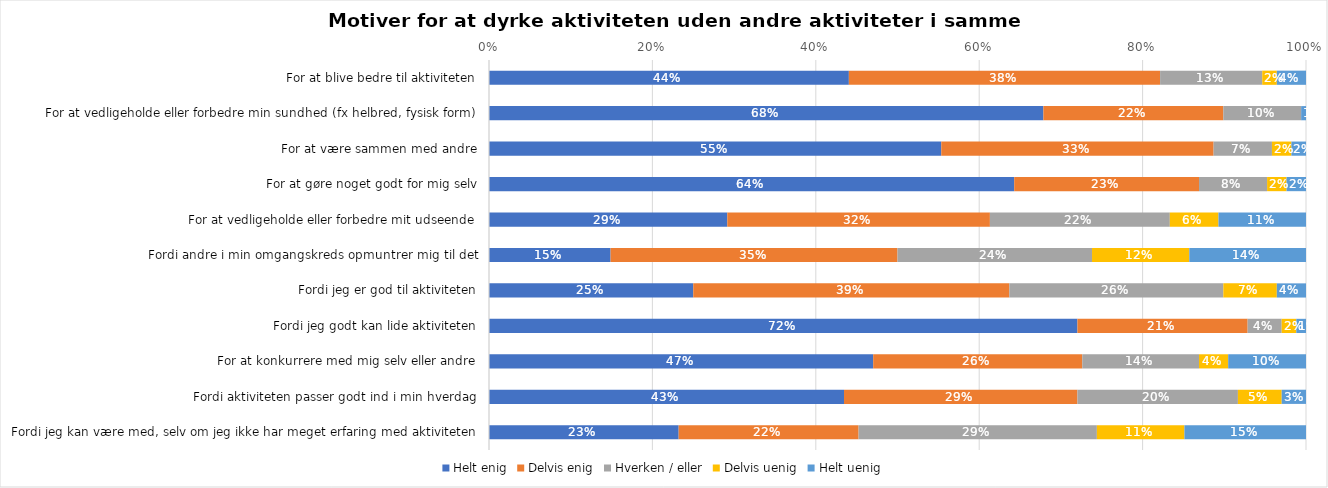
| Category | Helt enig | Delvis enig | Hverken / eller | Delvis uenig | Helt uenig |
|---|---|---|---|---|---|
| For at blive bedre til aktiviteten | 0.44 | 0.381 | 0.125 | 0.018 | 0.036 |
| For at vedligeholde eller forbedre min sundhed (fx helbred, fysisk form) | 0.679 | 0.22 | 0.095 | 0 | 0.006 |
| For at være sammen med andre | 0.554 | 0.333 | 0.071 | 0.024 | 0.018 |
| For at gøre noget godt for mig selv | 0.643 | 0.226 | 0.083 | 0.024 | 0.024 |
| For at vedligeholde eller forbedre mit udseende | 0.292 | 0.321 | 0.22 | 0.06 | 0.107 |
| Fordi andre i min omgangskreds opmuntrer mig til det | 0.149 | 0.351 | 0.238 | 0.119 | 0.143 |
| Fordi jeg er god til aktiviteten | 0.25 | 0.387 | 0.262 | 0.065 | 0.036 |
| Fordi jeg godt kan lide aktiviteten | 0.72 | 0.208 | 0.042 | 0.018 | 0.012 |
| For at konkurrere med mig selv eller andre | 0.47 | 0.256 | 0.143 | 0.036 | 0.095 |
| Fordi aktiviteten passer godt ind i min hverdag | 0.435 | 0.286 | 0.196 | 0.054 | 0.03 |
| Fordi jeg kan være med, selv om jeg ikke har meget erfaring med aktiviteten | 0.232 | 0.22 | 0.292 | 0.107 | 0.149 |